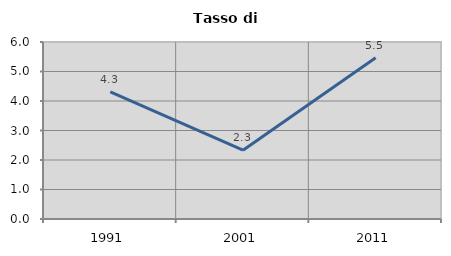
| Category | Tasso di disoccupazione   |
|---|---|
| 1991.0 | 4.311 |
| 2001.0 | 2.331 |
| 2011.0 | 5.468 |